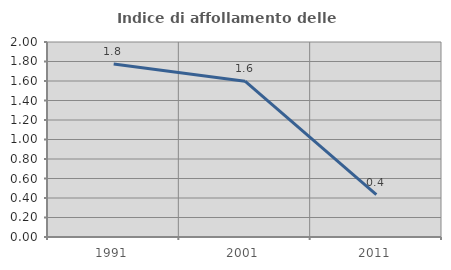
| Category | Indice di affollamento delle abitazioni  |
|---|---|
| 1991.0 | 1.773 |
| 2001.0 | 1.598 |
| 2011.0 | 0.436 |